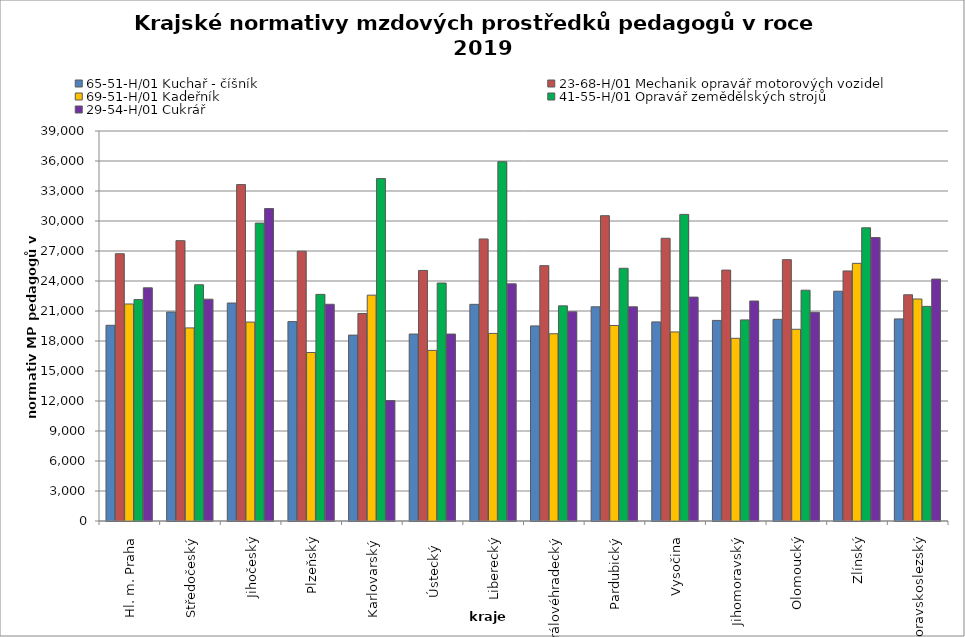
| Category | 65-51-H/01 Kuchař - číšník | 23-68-H/01 Mechanik opravář motorových vozidel | 69-51-H/01 Kadeřník | 41-55-H/01 Opravář zemědělských strojů | 29-54-H/01 Cukrář |
|---|---|---|---|---|---|
| Hl. m. Praha | 19569.643 | 26729.268 | 21700.99 | 22139.394 | 23317.021 |
| Středočeský | 20896.317 | 28031.663 | 19310.191 | 23626.121 | 22181.631 |
| Jihočeský | 21797.531 | 33641.081 | 19892.117 | 29790.457 | 31246.784 |
| Plzeňský | 19938.784 | 26982.249 | 16851.441 | 22664.016 | 21673.004 |
| Karlovarský  | 18587.82 | 20748.768 | 22584.45 | 34243.902 | 12044.61 |
| Ústecký   | 18694.616 | 25057.471 | 17060.87 | 23796.24 | 18694.616 |
| Liberecký | 21667.096 | 28202.13 | 18760.018 | 35931.054 | 23716.184 |
| Královéhradecký | 19510.23 | 25535.103 | 18724.989 | 21512.805 | 20917.589 |
| Pardubický | 21419.646 | 30531.599 | 19551.592 | 25272.198 | 21419.646 |
| Vysočina | 19910.716 | 28272.361 | 18907.491 | 30660.647 | 22389.365 |
| Jihomoravský | 20058.054 | 25091.228 | 18271.03 | 20111.821 | 21998.682 |
| Olomoucký | 20167.95 | 26134.107 | 19172.426 | 23081.557 | 20868.55 |
| Zlínský | 22979.676 | 25007.294 | 25765.091 | 29318.897 | 28341.6 |
| Moravskoslezský | 20207.912 | 22622.039 | 22199.09 | 21461.651 | 24191.63 |